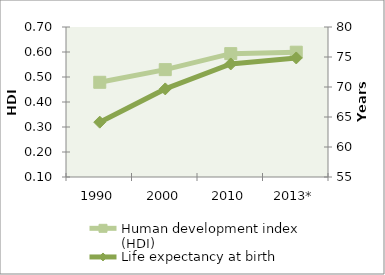
| Category | Human development index (HDI) |
|---|---|
| 1990 | 0.479 |
| 2000 | 0.529 |
| 2010 | 0.593 |
| 2013* | 0.599 |